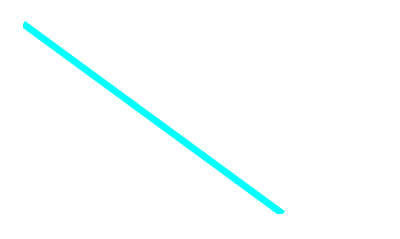
| Category | TUBO |
|---|---|
| 0.0 | 80 |
| 1.0 | 0 |